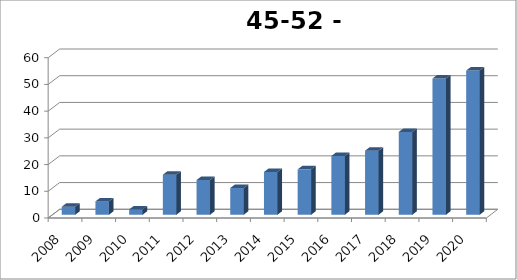
| Category | Esch |
|---|---|
| 2008.0 | 3 |
| 2009.0 | 5 |
| 2010.0 | 2 |
| 2011.0 | 15 |
| 2012.0 | 13 |
| 2013.0 | 10 |
| 2014.0 | 16 |
| 2015.0 | 17 |
| 2016.0 | 22 |
| 2017.0 | 24 |
| 2018.0 | 31 |
| 2019.0 | 51 |
| 2020.0 | 54 |